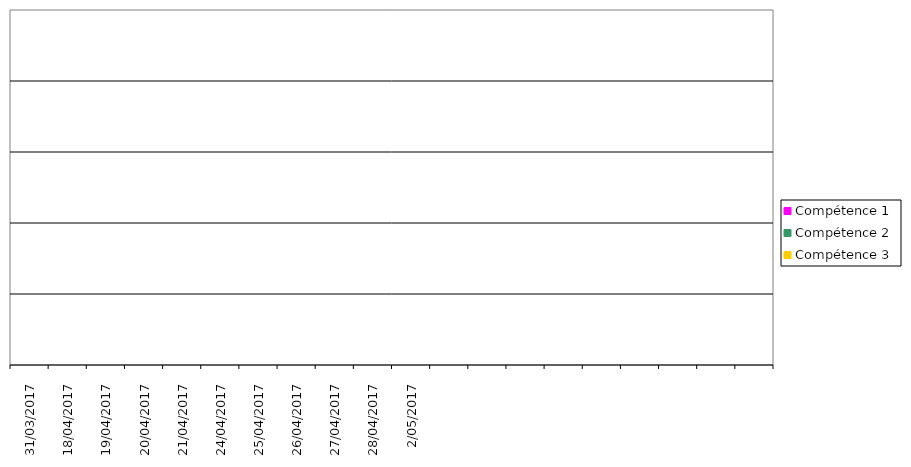
| Category | Compétence 1 | Compétence 2 | Compétence 3 |
|---|---|---|---|
| 31-03-2017 | 0 | 0 | 0 |
| 18-04-2017 | 0 | 0 | 0 |
| 19-04-2017 | 0 | 0 | 0 |
| 20-04-2017 | 0 | 0 | 0 |
| 21-04-2017 | 0 | 0 | 0 |
| 24-04-2017 | 0 | 0 | 0 |
| 25-04-2017 | 0 | 0 | 0 |
| 26-04-2017 | 0 | 0 | 0 |
| 27-04-2017 | 0 | 0 | 0 |
| 28-04-2017 | 0 | 0 | 0 |
| 2-05-2017 | 0 | 0 | 0 |